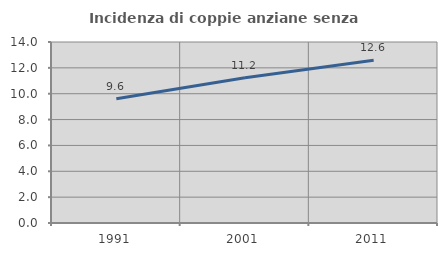
| Category | Incidenza di coppie anziane senza figli  |
|---|---|
| 1991.0 | 9.614 |
| 2001.0 | 11.23 |
| 2011.0 | 12.589 |